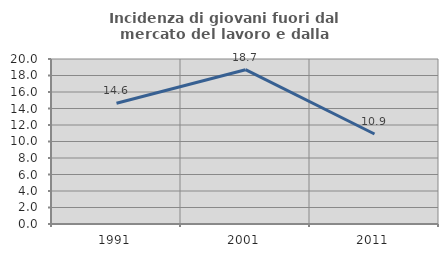
| Category | Incidenza di giovani fuori dal mercato del lavoro e dalla formazione  |
|---|---|
| 1991.0 | 14.634 |
| 2001.0 | 18.702 |
| 2011.0 | 10.913 |